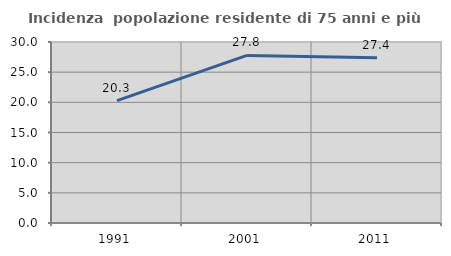
| Category | Incidenza  popolazione residente di 75 anni e più |
|---|---|
| 1991.0 | 20.276 |
| 2001.0 | 27.778 |
| 2011.0 | 27.397 |